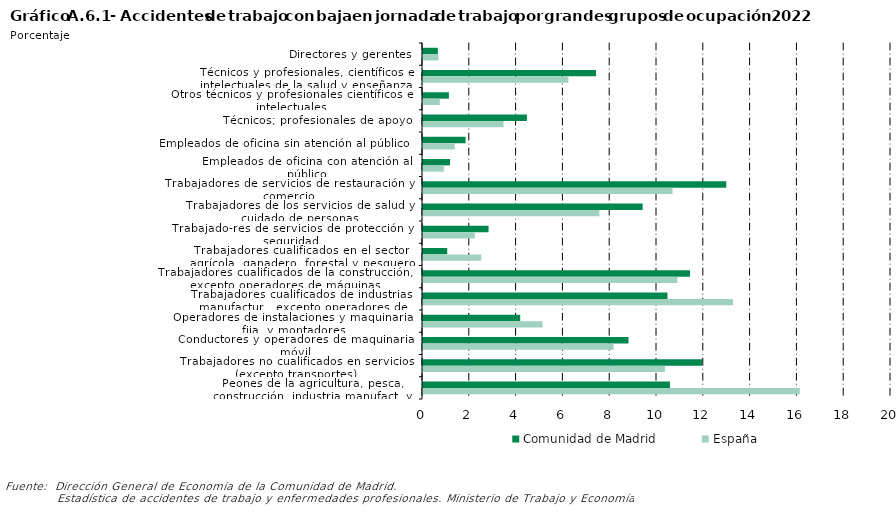
| Category | Comunidad de Madrid | España |
|---|---|---|
| Directores y gerentes | 0.634 | 0.659 |
| Técnicos y profesionales, científicos e intelectuales de la salud y enseñanza | 7.395 | 6.214 |
| Otros técnicos y profesionales científicos e intelectuales | 1.106 | 0.717 |
| Técnicos; profesionales de apoyo | 4.439 | 3.441 |
| Empleados de oficina sin atención al público | 1.82 | 1.356 |
| Empleados de oficina con atención al público | 1.153 | 0.89 |
| Trabajadores de servicios de restauración y comercio | 12.96 | 10.666 |
| Trabajadores de los servicios de salud y cuidado de personas | 9.387 | 7.537 |
| Trabajado-res de servicios de protección y seguridad  | 2.802 | 2.218 |
| Trabajadores cualificados en el sector agrícola, ganadero, forestal y pesquero | 1.036 | 2.488 |
| Trabajadores cualificados de la construcción, excepto operadores de máquinas | 11.409 | 10.874 |
| Trabajadores cualificados de industrias manufactur., excepto operadores de instalaciones y máquinas | 10.448 | 13.247 |
| Operadores de instalaciones y maquinaria fija, y montadores | 4.155 | 5.108 |
| Conductores y operadores de maquinaria móvil | 8.78 | 8.144 |
| Trabajadores no cualificados en servicios (excepto transportes) | 11.923 | 10.338 |
| Peones de la agricultura, pesca, construcción, industria manufact. y transporte | 10.553 | 16.103 |